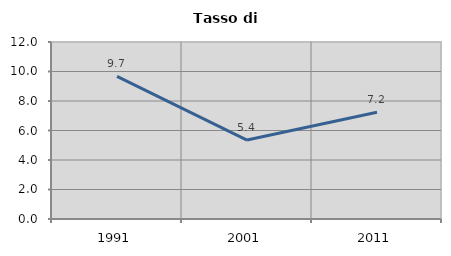
| Category | Tasso di disoccupazione   |
|---|---|
| 1991.0 | 9.675 |
| 2001.0 | 5.352 |
| 2011.0 | 7.238 |